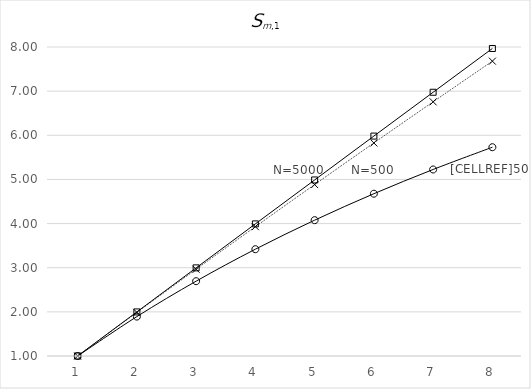
| Category | Series 0 | Series 1 | Series 2 | Series 3 | Series 4 |
|---|---|---|---|---|---|
| 0 | 1 | 1 |  |  | 1 |
| 1 | 1.893 | 1.988 |  |  | 1.999 |
| 2 | 2.695 | 2.965 |  |  | 2.996 |
| 3 | 3.419 | 3.93 |  |  | 3.993 |
| 4 | 4.077 | 4.883 |  |  | 4.988 |
| 5 | 4.676 | 5.826 |  |  | 5.982 |
| 6 | 5.225 | 6.758 |  |  | 6.975 |
| 7 | 5.73 | 7.679 |  |  | 7.967 |